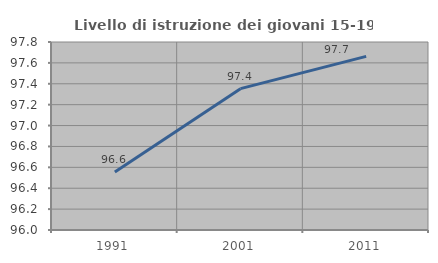
| Category | Livello di istruzione dei giovani 15-19 anni |
|---|---|
| 1991.0 | 96.556 |
| 2001.0 | 97.353 |
| 2011.0 | 97.663 |